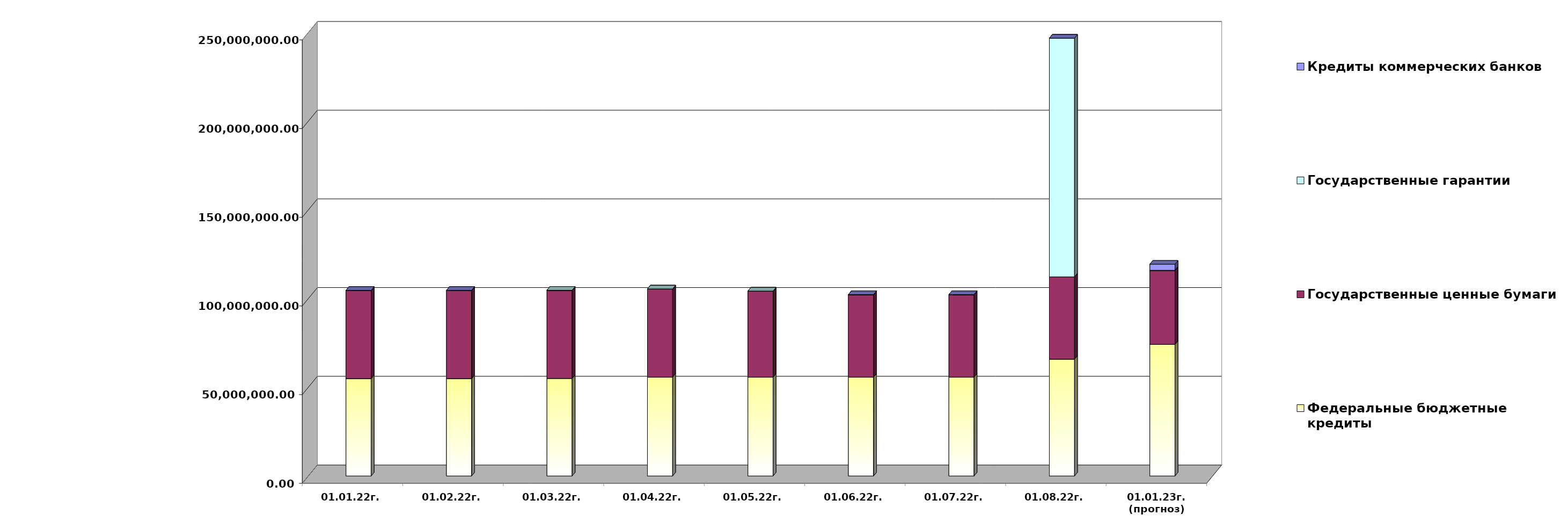
| Category | Федеральные бюджетные кредиты | Государственные ценные бумаги  | Государственные гарантии | Кредиты коммерческих банков |
|---|---|---|---|---|
| 01.01.22г. | 54900618.713 | 49600000 | 141570.67 | 0 |
| 01.02.22г. | 54900618.713 | 49600000 | 139748.87 | 0 |
| 01.03.22г. | 54970753.113 | 49600000 | 139748.87 | 0 |
| 01.04.22г. | 55700753.113 | 49600000 | 139748.87 | 0 |
| 01.05.22г. | 55700753.113 | 48400000 | 138270.964 | 0 |
| 01.06.22г. | 55705077.413 | 46400000 | 138270.964 | 0 |
| 01.07.22г. | 55705077.413 | 46400000 | 138270.964 | 0 |
| 01.08.22г. | 65845099.48 | 46400000 | 134576199 | 0 |
| 01.01.23г.
(прогноз) | 74199281.9 | 41500000 | 265278.1 | 3438072.1 |